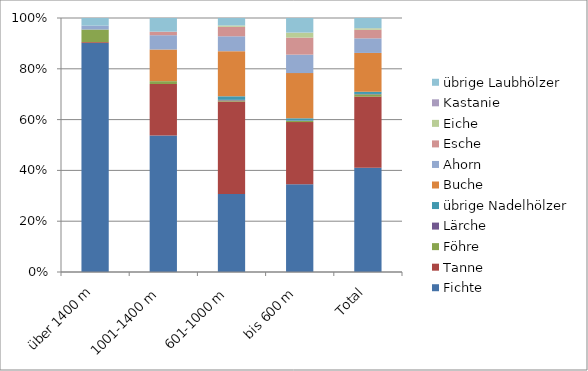
| Category | Fichte | Tanne | Föhre | Lärche | übrige Nadelhölzer | Buche | Ahorn | Esche | Eiche | Kastanie | übrige Laubhölzer |
|---|---|---|---|---|---|---|---|---|---|---|---|
| über 1400 m | 975.8 | 3.7 | 53.9 | 0 | 0 | 0 | 16.5 | 0 | 0 | 0 | 32.6 |
| 1001-1400 m | 2288.9 | 861.9 | 46.9 | 0.5 | 0.5 | 530 | 239.3 | 58.1 | 0 | 1.3 | 229 |
| 601-1000 m | 2661.8 | 3147.1 | 36.2 | 21.4 | 121.2 | 1537.9 | 507.4 | 323.9 | 43.1 | 1.8 | 254.4 |
| bis 600 m | 948.7 | 672 | 13 | 3.7 | 24.5 | 488.9 | 199.6 | 184.2 | 53.6 | 0.8 | 157.5 |
| Total | 6875.3 | 4684.6 | 150 | 25.6 | 146.2 | 2556.8 | 962.8 | 566.2 | 96.7 | 3.8 | 673.5 |